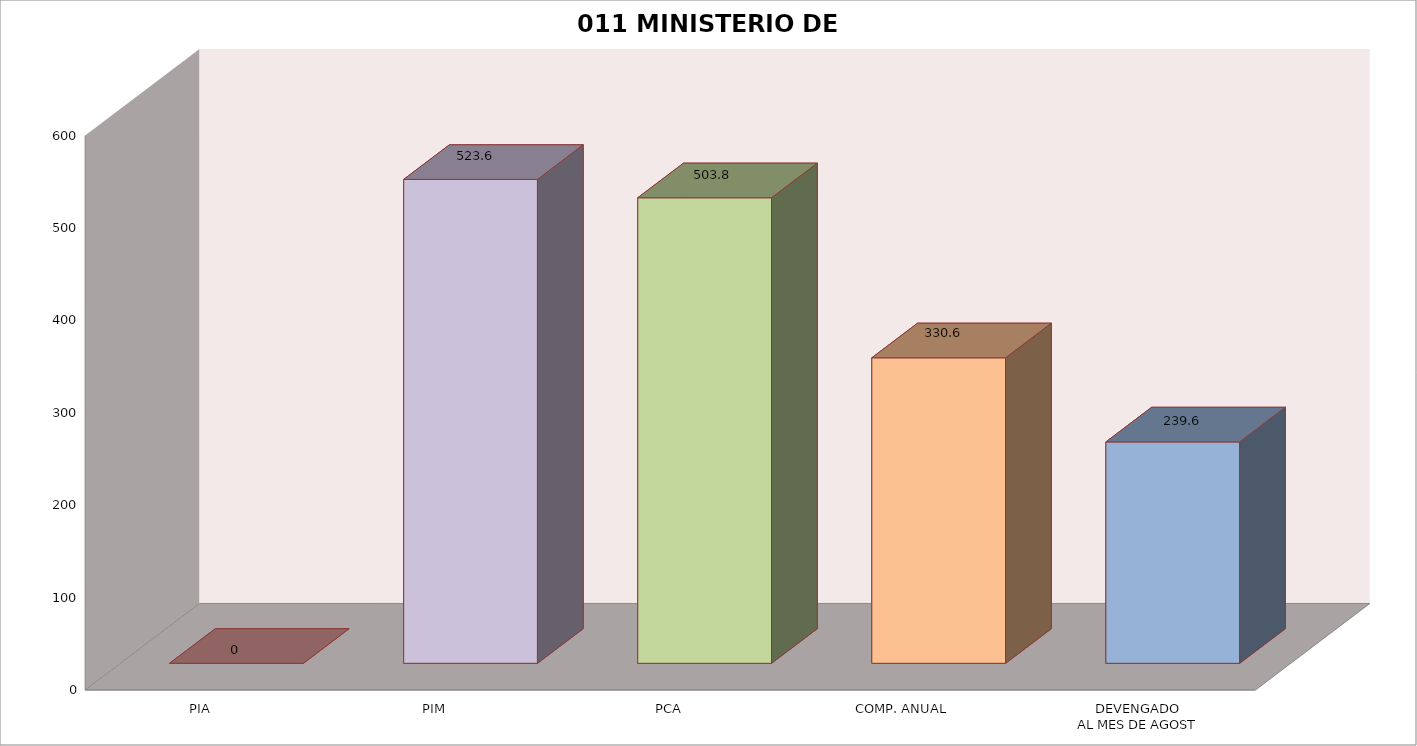
| Category | 011 MINISTERIO DE SALUD |
|---|---|
| PIA | 0 |
| PIM | 523.636 |
| PCA | 503.774 |
| COMP. ANUAL | 330.598 |
| DEVENGADO
AL MES DE AGOST | 239.584 |